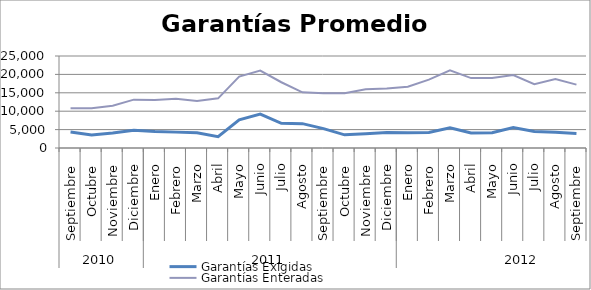
| Category | Garantías Exigidas | Garantías Enteradas |
|---|---|---|
| 0 | 4372.607 | 10829.062 |
| 1 | 3557.93 | 10787.9 |
| 2 | 4056.528 | 11463.422 |
| 3 | 4832.111 | 13142.881 |
| 4 | 4466.32 | 13061.162 |
| 5 | 4313.718 | 13357.444 |
| 6 | 4162.491 | 12796.251 |
| 7 | 3090.395 | 13495.263 |
| 8 | 7655.186 | 19416.342 |
| 9 | 9198.096 | 21035.301 |
| 10 | 6699.851 | 17866.843 |
| 11 | 6615.292 | 15119.839 |
| 12 | 5266.973 | 14911.639 |
| 13 | 3572.137 | 14861.465 |
| 14 | 3876.388 | 15976.819 |
| 15 | 4182.413 | 16147.351 |
| 16 | 4146.8 | 16662.483 |
| 17 | 4190.531 | 18572.749 |
| 18 | 5482.211 | 21128.648 |
| 19 | 4079.038 | 18997.51 |
| 20 | 4141.554 | 19005.364 |
| 21 | 5549.139 | 19818.91 |
| 22 | 4487.023 | 17351.39 |
| 23 | 4277.924 | 18719.955 |
| 24 | 3940.893 | 17217.403 |